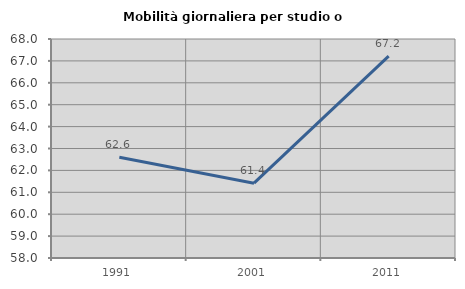
| Category | Mobilità giornaliera per studio o lavoro |
|---|---|
| 1991.0 | 62.597 |
| 2001.0 | 61.416 |
| 2011.0 | 67.219 |